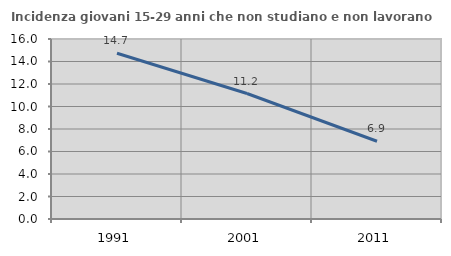
| Category | Incidenza giovani 15-29 anni che non studiano e non lavorano  |
|---|---|
| 1991.0 | 14.729 |
| 2001.0 | 11.155 |
| 2011.0 | 6.909 |